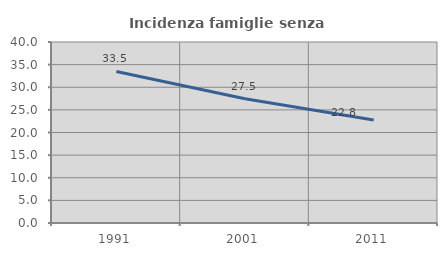
| Category | Incidenza famiglie senza nuclei |
|---|---|
| 1991.0 | 33.5 |
| 2001.0 | 27.451 |
| 2011.0 | 22.764 |